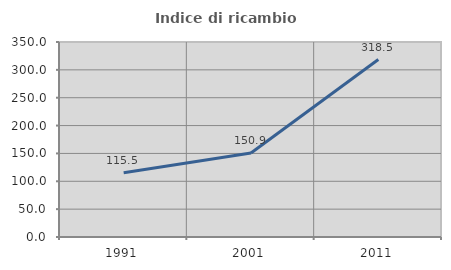
| Category | Indice di ricambio occupazionale  |
|---|---|
| 1991.0 | 115.479 |
| 2001.0 | 150.92 |
| 2011.0 | 318.537 |